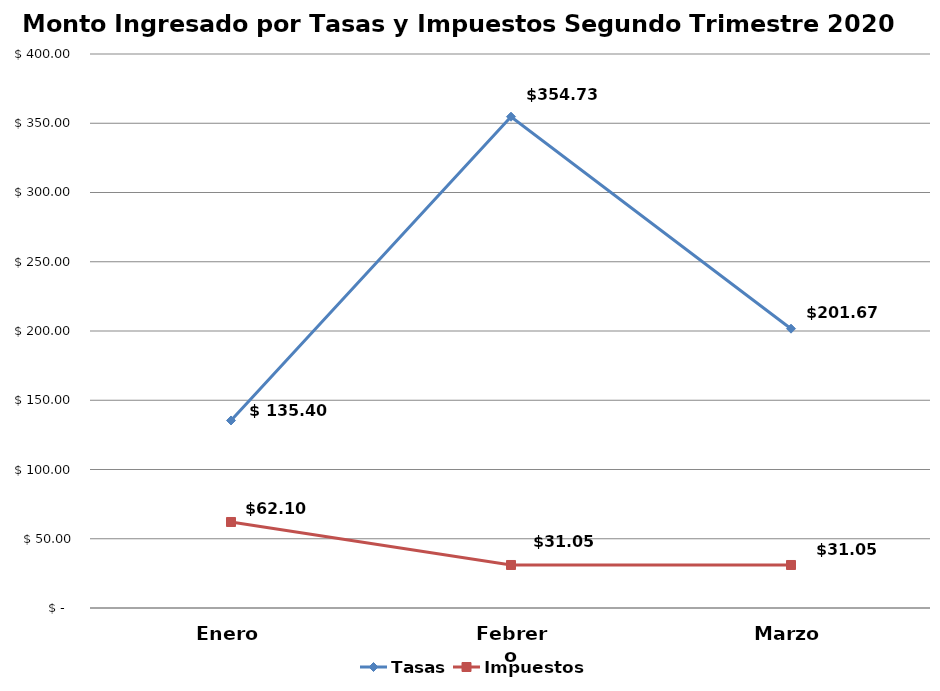
| Category | Tasas | Impuestos |
|---|---|---|
| Enero | 135.4 | 62.1 |
| Febrero | 354.73 | 31.05 |
| Marzo | 201.67 | 31.05 |